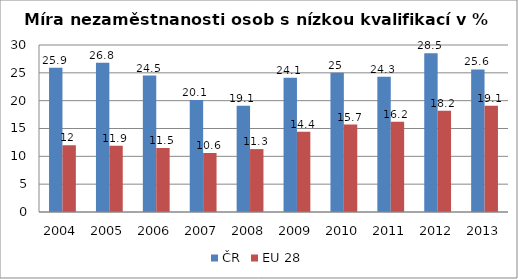
| Category | ČR | EU 28 |
|---|---|---|
| 2004 | 25.9 | 12 |
| 2005 | 26.8 | 11.9 |
| 2006 | 24.5 | 11.5 |
| 2007 | 20.1 | 10.6 |
| 2008 | 19.1 | 11.3 |
| 2009 | 24.1 | 14.4 |
| 2010 | 25 | 15.7 |
| 2011 | 24.3 | 16.2 |
| 2012 | 28.5 | 18.2 |
| 2013 | 25.6 | 19.1 |